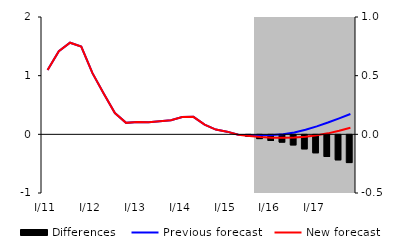
| Category | Differences |
|---|---|
| 0 | 0 |
| 1 | 0 |
| 2 | 0 |
| 3 | 0 |
| 4 | 0 |
| 5 | 0 |
| 6 | 0 |
| 7 | 0 |
| 8 | 0 |
| 9 | 0 |
| 10 | 0 |
| 11 | 0 |
| 12 | 0 |
| 13 | 0 |
| 14 | 0 |
| 15 | 0 |
| 16 | 0 |
| 17 | 0 |
| 18 | -0.011 |
| 19 | -0.032 |
| 20 | -0.048 |
| 21 | -0.062 |
| 22 | -0.086 |
| 23 | -0.119 |
| 24 | -0.153 |
| 25 | -0.185 |
| 26 | -0.213 |
| 27 | -0.236 |